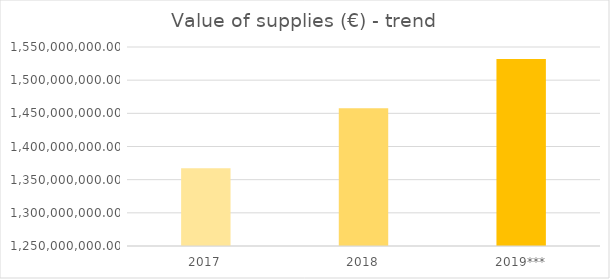
| Category | Series 0 |
|---|---|
| 2017 | 1367260945 |
| 2018 | 1457706333 |
| 2019*** | 1532074318 |